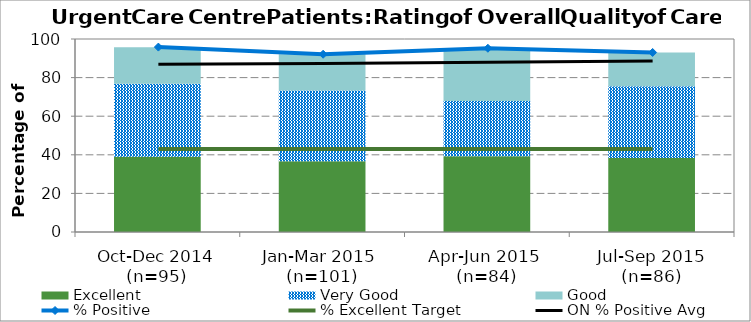
| Category | Excellent | Very Good | Good |
|---|---|---|---|
| Oct-Dec 2014 (n=95) | 38.95 | 37.89 | 18.95 |
| Jan-Mar 2015 
(n=101) | 36.63 | 36.63 | 18.81 |
| Apr-Jun 2015 
(n=84) | 39.29 | 28.57 | 27.38 |
| Jul-Sep 2015 (n=86) | 38.37 | 37.21 | 17.44 |